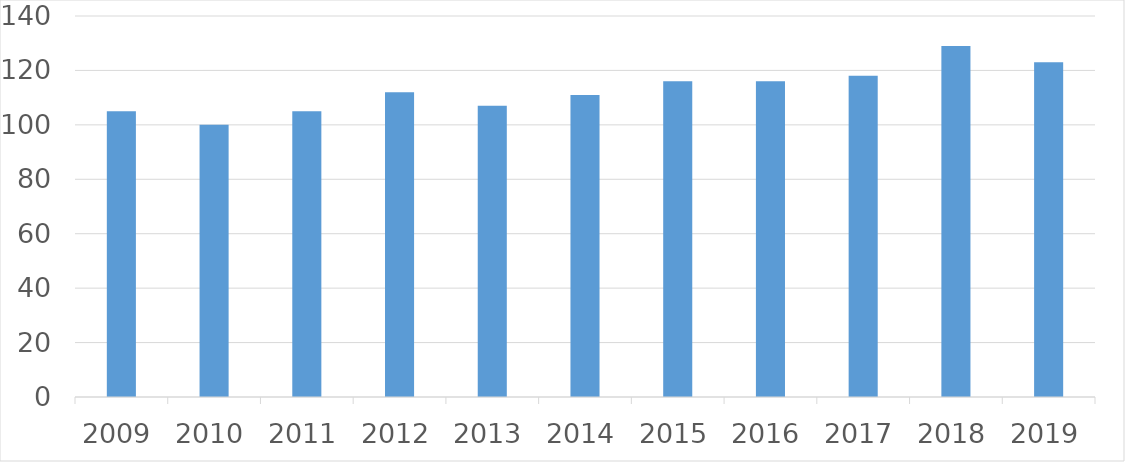
| Category | Series 0 |
|---|---|
| 2009 | 105 |
| 2010 | 100 |
| 2011 | 105 |
| 2012 | 112 |
| 2013 | 107 |
| 2014 | 111 |
| 2015 | 116 |
| 2016 | 116 |
| 2017 | 118 |
| 2018 | 129 |
| 2019 | 123 |